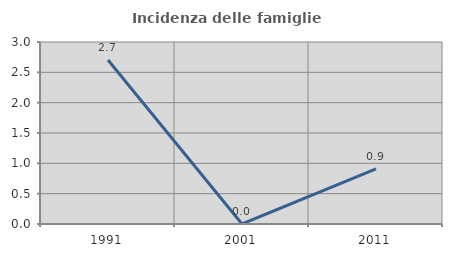
| Category | Incidenza delle famiglie numerose |
|---|---|
| 1991.0 | 2.703 |
| 2001.0 | 0 |
| 2011.0 | 0.909 |